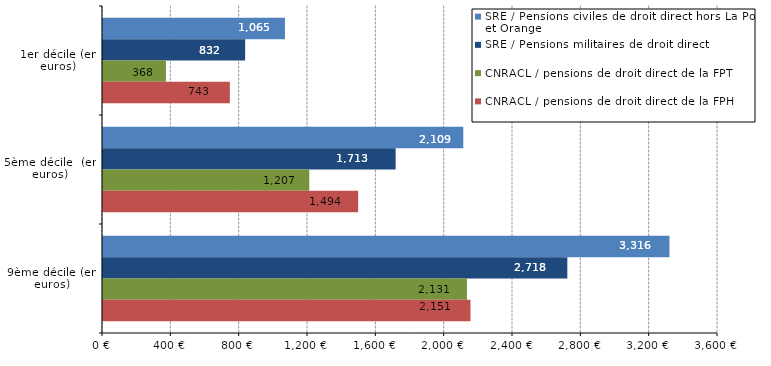
| Category | SRE / Pensions civiles de droit direct hors La Poste et Orange | SRE / Pensions militaires de droit direct | CNRACL / pensions de droit direct de la FPT | CNRACL / pensions de droit direct de la FPH |
|---|---|---|---|---|
| 1er décile (en euros) | 1065 | 832 | 368.3 | 742.6 |
| 5ème décile  (en euros) | 2109 | 1713 | 1207.4 | 1493.5 |
| 9ème décile (en euros) | 3316 | 2718 | 2130.5 | 2151.1 |